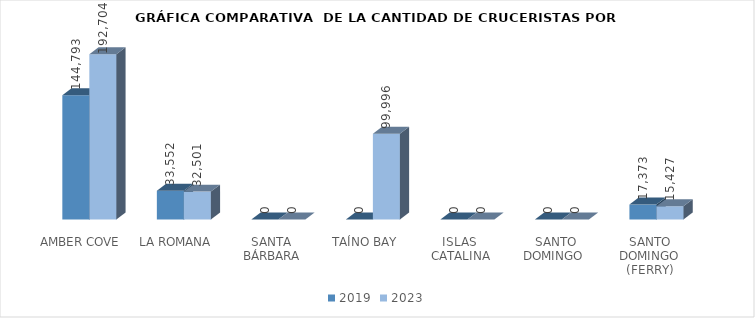
| Category | 2019 | 2023 |
|---|---|---|
| AMBER COVE | 144793 | 192704 |
| LA ROMANA | 33552 | 32501 |
| SANTA BÁRBARA | 0 | 0 |
| TAÍNO BAY | 0 | 99996 |
| ISLAS  CATALINA | 0 | 0 |
| SANTO DOMINGO  | 0 | 0 |
| SANTO DOMINGO (FERRY) | 17373 | 15427 |